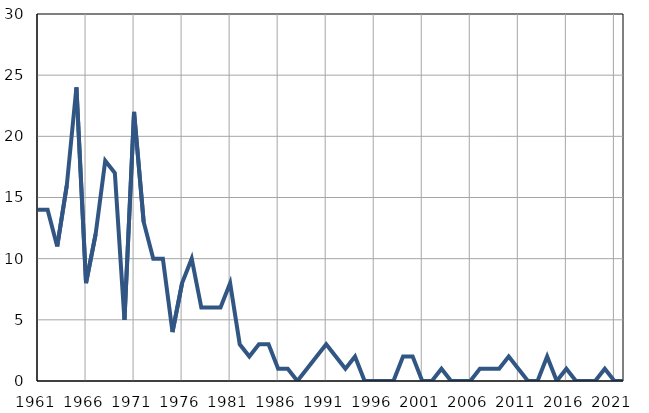
| Category | Infants
deaths |
|---|---|
| 1961.0 | 14 |
| 1962.0 | 14 |
| 1963.0 | 11 |
| 1964.0 | 16 |
| 1965.0 | 24 |
| 1966.0 | 8 |
| 1967.0 | 12 |
| 1968.0 | 18 |
| 1969.0 | 17 |
| 1970.0 | 5 |
| 1971.0 | 22 |
| 1972.0 | 13 |
| 1973.0 | 10 |
| 1974.0 | 10 |
| 1975.0 | 4 |
| 1976.0 | 8 |
| 1977.0 | 10 |
| 1978.0 | 6 |
| 1979.0 | 6 |
| 1980.0 | 6 |
| 1981.0 | 8 |
| 1982.0 | 3 |
| 1983.0 | 2 |
| 1984.0 | 3 |
| 1985.0 | 3 |
| 1986.0 | 1 |
| 1987.0 | 1 |
| 1988.0 | 0 |
| 1989.0 | 1 |
| 1990.0 | 2 |
| 1991.0 | 3 |
| 1992.0 | 2 |
| 1993.0 | 1 |
| 1994.0 | 2 |
| 1995.0 | 0 |
| 1996.0 | 0 |
| 1997.0 | 0 |
| 1998.0 | 0 |
| 1999.0 | 2 |
| 2000.0 | 2 |
| 2001.0 | 0 |
| 2002.0 | 0 |
| 2003.0 | 1 |
| 2004.0 | 0 |
| 2005.0 | 0 |
| 2006.0 | 0 |
| 2007.0 | 1 |
| 2008.0 | 1 |
| 2009.0 | 1 |
| 2010.0 | 2 |
| 2011.0 | 1 |
| 2012.0 | 0 |
| 2013.0 | 0 |
| 2014.0 | 2 |
| 2015.0 | 0 |
| 2016.0 | 1 |
| 2017.0 | 0 |
| 2018.0 | 0 |
| 2019.0 | 0 |
| 2020.0 | 1 |
| 2021.0 | 0 |
| 2022.0 | 0 |